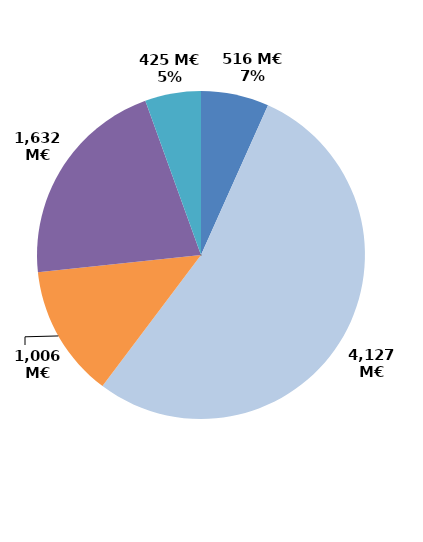
| Category | Series 0 |
|---|---|
| Contrats aidés marchand (hors IAE) | 516.419 |
| Contrats aidés non marchand (hors IAE) | 4127.058 |
| Insertion par l'activité économique | 1005.993 |
| Mesures en faveur des handicapés | 1631.935 |
| Autres emplois aidés | 424.757 |